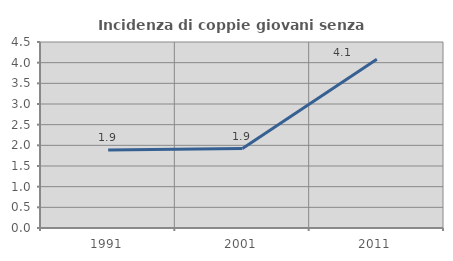
| Category | Incidenza di coppie giovani senza figli |
|---|---|
| 1991.0 | 1.887 |
| 2001.0 | 1.923 |
| 2011.0 | 4.082 |